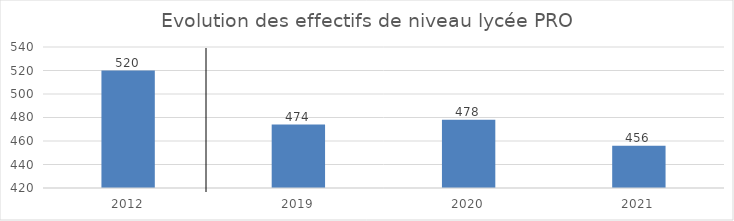
| Category | Series 0 |
|---|---|
| 2012.0 | 520 |
| 2019.0 | 474 |
| 2020.0 | 478 |
| 2021.0 | 456 |